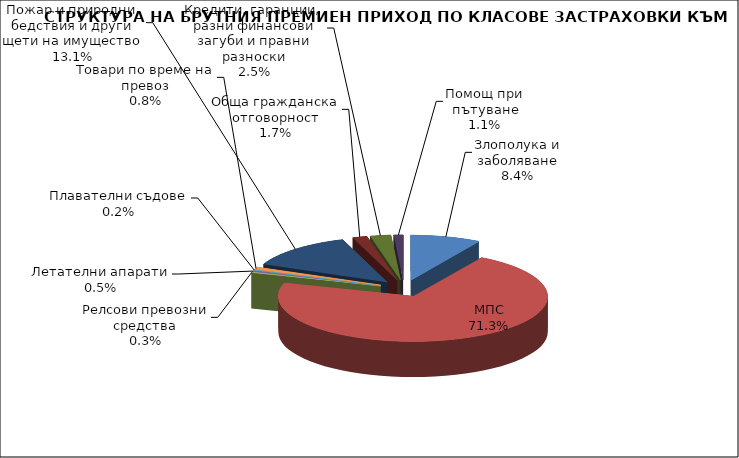
| Category | Злополука и заболяване |
|---|---|
| Злополука и заболяване | 0.084 |
| МПС | 0.713 |
| Релсови превозни средства | 0.003 |
| Летателни апарати | 0.005 |
| Плавателни съдове | 0.002 |
| Товари по време на превоз | 0.008 |
| Пожар и природни бедствия и други щети на имущество | 0.131 |
| Обща гражданска отговорност | 0.017 |
| Кредити, гаранции, разни финансови загуби и правни разноски | 0.025 |
| Помощ при пътуване | 0.011 |